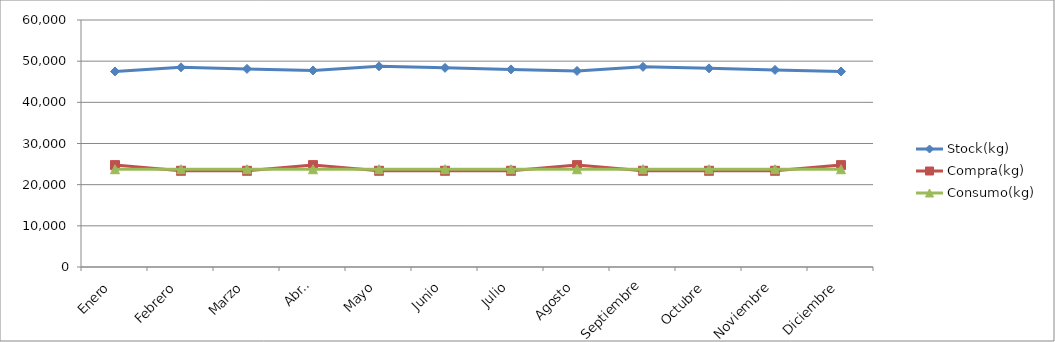
| Category | Stock(kg) | Compra(kg) | Consumo(kg) |
|---|---|---|---|
| Enero | 47500 | 24750 | 23750 |
| Febrero | 48500 | 23375 | 23750 |
| Marzo | 48125 | 23375 | 23750 |
| Abril | 47750 | 24750 | 23750 |
| Mayo | 48750 | 23375 | 23750 |
| Junio | 48375 | 23375 | 23750 |
| Julio | 48000 | 23375 | 23750 |
| Agosto | 47625 | 24750 | 23750 |
| Septiembre | 48625 | 23375 | 23750 |
| Octubre | 48250 | 23375 | 23750 |
| Noviembre | 47875 | 23375 | 23750 |
| Diciembre | 47500 | 24750 | 23750 |